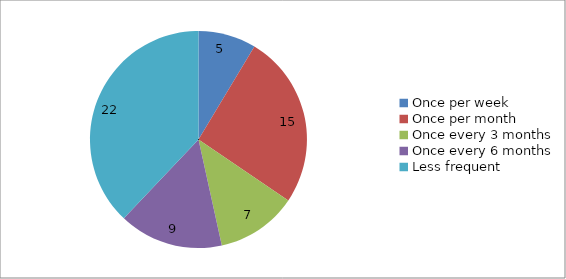
| Category | Series 0 |
|---|---|
| Once per week | 5 |
| Once per month | 15 |
| Once every 3 months | 7 |
| Once every 6 months | 9 |
| Less frequent | 22 |